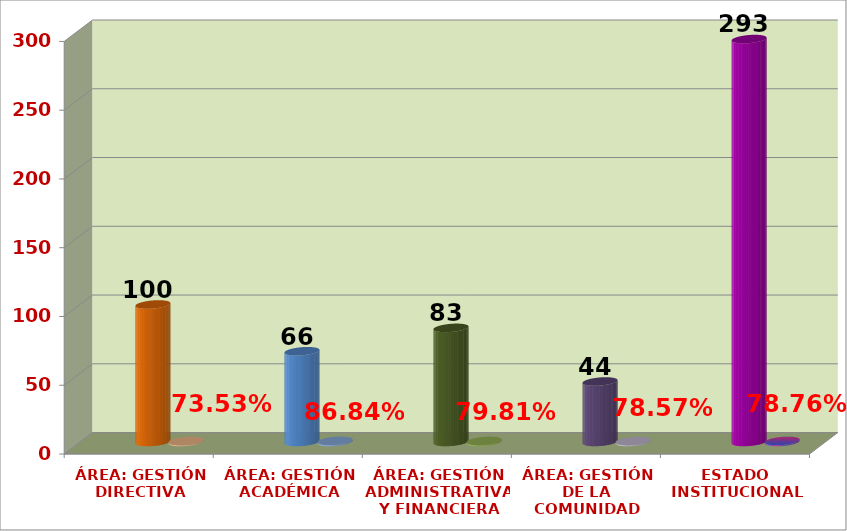
| Category | Series 0 | Series 1 | Series 2 |
|---|---|---|---|
| ÁREA: GESTIÓN DIRECTIVA |  | 100 | 0.735 |
| ÁREA: GESTIÓN ACADÉMICA |  | 66 | 0.868 |
| ÁREA: GESTIÓN ADMINISTRATIVA Y FINANCIERA |  | 83 | 0.798 |
| ÁREA: GESTIÓN DE LA COMUNIDAD |  | 44 | 0.786 |
| ESTADO INSTITUCIONAL |  | 293 | 0.788 |